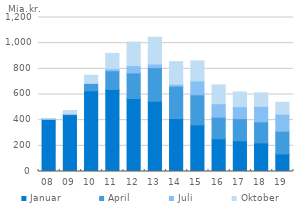
| Category | Januar | April | Juli | Oktober |
|---|---|---|---|---|
| 08 | 406.066 | 3.208 | 0.002 | 1.897 |
| 09 | 442.735 | 5.252 | 0.002 | 27.282 |
| 10 | 628.498 | 58.839 | 0.001 | 62.14 |
| 11 | 639.229 | 145.727 | 15.785 | 119.362 |
| 12 | 568.647 | 199.404 | 56.723 | 183.867 |
| 13 | 547.394 | 261.644 | 28.15 | 209.401 |
| 14 | 412.719 | 252.308 | 15.427 | 175.823 |
| 15 | 362.944 | 234.629 | 108.025 | 156.304 |
| 16 | 254.847 | 168.223 | 104.921 | 146.733 |
| 17 | 239.172 | 172.349 | 93.916 | 114.324 |
| 18 | 222.619 | 164.605 | 119.886 | 105.523 |
| 19 | 137.084 | 176.966 | 132.184 | 93.181 |